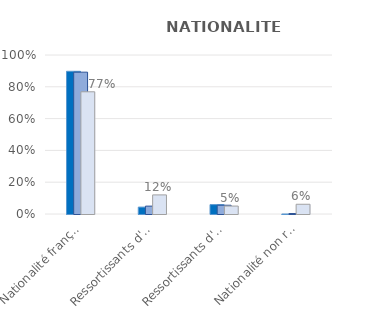
| Category | Ensemble de la population | Ensemble des victimes de crimes ou délits | Victimes de crimes ou délits à caractère raciste |
|---|---|---|---|
| Nationalité française | 0.898 | 0.892 | 0.769 |
| Ressortissants d'un pays d'Afrique | 0.043 | 0.05 | 0.12 |
| Ressortissants d'un autre pays | 0.059 | 0.055 | 0.05 |
| Nationalité non renseignée | 0 | 0.003 | 0.061 |